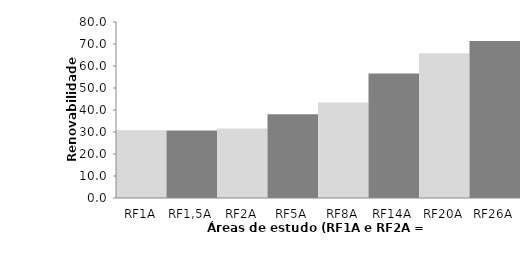
| Category | Series 0 |
|---|---|
| RF1A | 30.749 |
| RF1,5A | 30.692 |
| RF2A | 31.619 |
| RF5A | 38.018 |
| RF8A | 43.361 |
| RF14A | 56.635 |
| RF20A | 65.746 |
| RF26A | 71.355 |